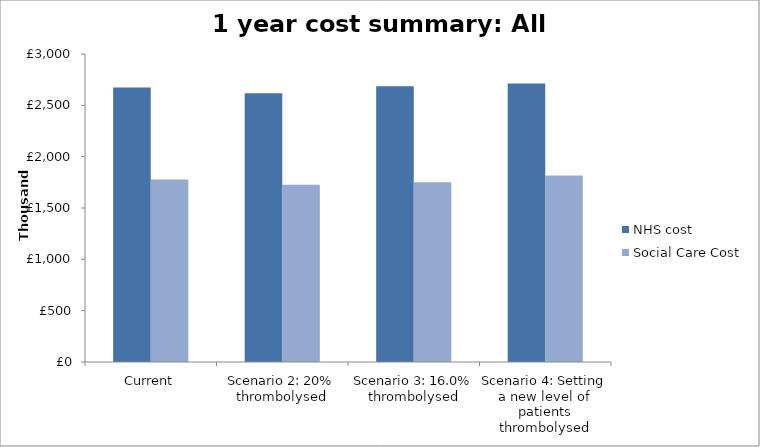
| Category | NHS cost | Social Care Cost |
|---|---|---|
| Current | 2672500 | 1778600 |
| Scenario 2: 20% thrombolysed | 2617500 | 1727400 |
| Scenario 3: 16.0% thrombolysed | 2685600 | 1751200 |
| Scenario 4: Setting a new level of patients thrombolysed | 2713000 | 1816300 |